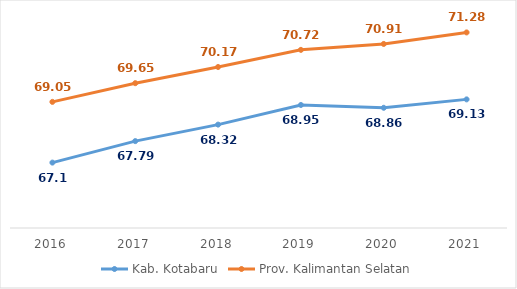
| Category | Kab. Kotabaru | Prov. Kalimantan Selatan |
|---|---|---|
| 2016.0 | 67.1 | 69.05 |
| 2017.0 | 67.79 | 69.65 |
| 2018.0 | 68.32 | 70.17 |
| 2019.0 | 68.95 | 70.72 |
| 2020.0 | 68.86 | 70.91 |
| 2021.0 | 69.13 | 71.28 |